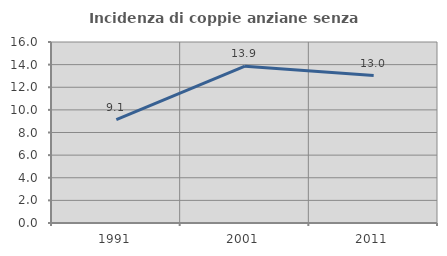
| Category | Incidenza di coppie anziane senza figli  |
|---|---|
| 1991.0 | 9.141 |
| 2001.0 | 13.864 |
| 2011.0 | 13.038 |